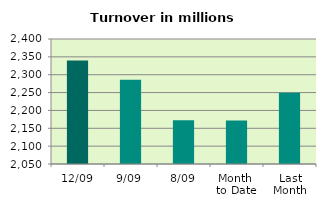
| Category | Series 0 |
|---|---|
| 12/09 | 2339.698 |
| 9/09 | 2285.914 |
| 8/09 | 2172.419 |
| Month 
to Date | 2171.654 |
| Last
Month | 2249.305 |